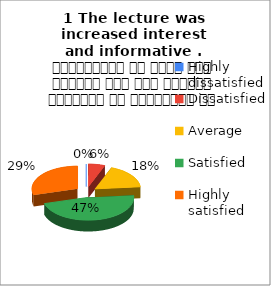
| Category | 1 The lecture was  increased interest  and informative .  व्याख्यान से रुचि में वृद्धि हुई एवं शिक्षण जानकारी से परिपूर्ण था |
|---|---|
| Highly dissatisfied | 0 |
| Dissatisfied | 1 |
| Average | 3 |
| Satisfied | 8 |
| Highly satisfied | 5 |